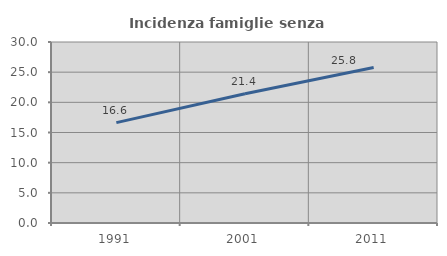
| Category | Incidenza famiglie senza nuclei |
|---|---|
| 1991.0 | 16.636 |
| 2001.0 | 21.429 |
| 2011.0 | 25.761 |